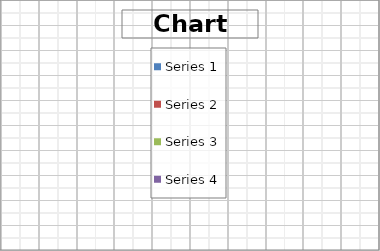
| Category | Series 1 | Series 2 | Series 3 | Series 4 |
|---|---|---|---|---|
| Point 1 | 8 | 7 | 3 | 4 |
| Point 2 | 6 | 5 | 3 | 5 |
| Point 3 | 2 | 3 | 5 | 6 |
| Point 4 | 2 | 1 | 6 | 7 |